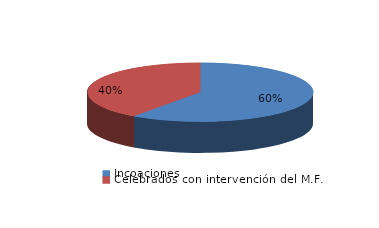
| Category | Series 0 |
|---|---|
| Incoaciones | 2124 |
| Celebrados con intervención del M.F. | 1423 |